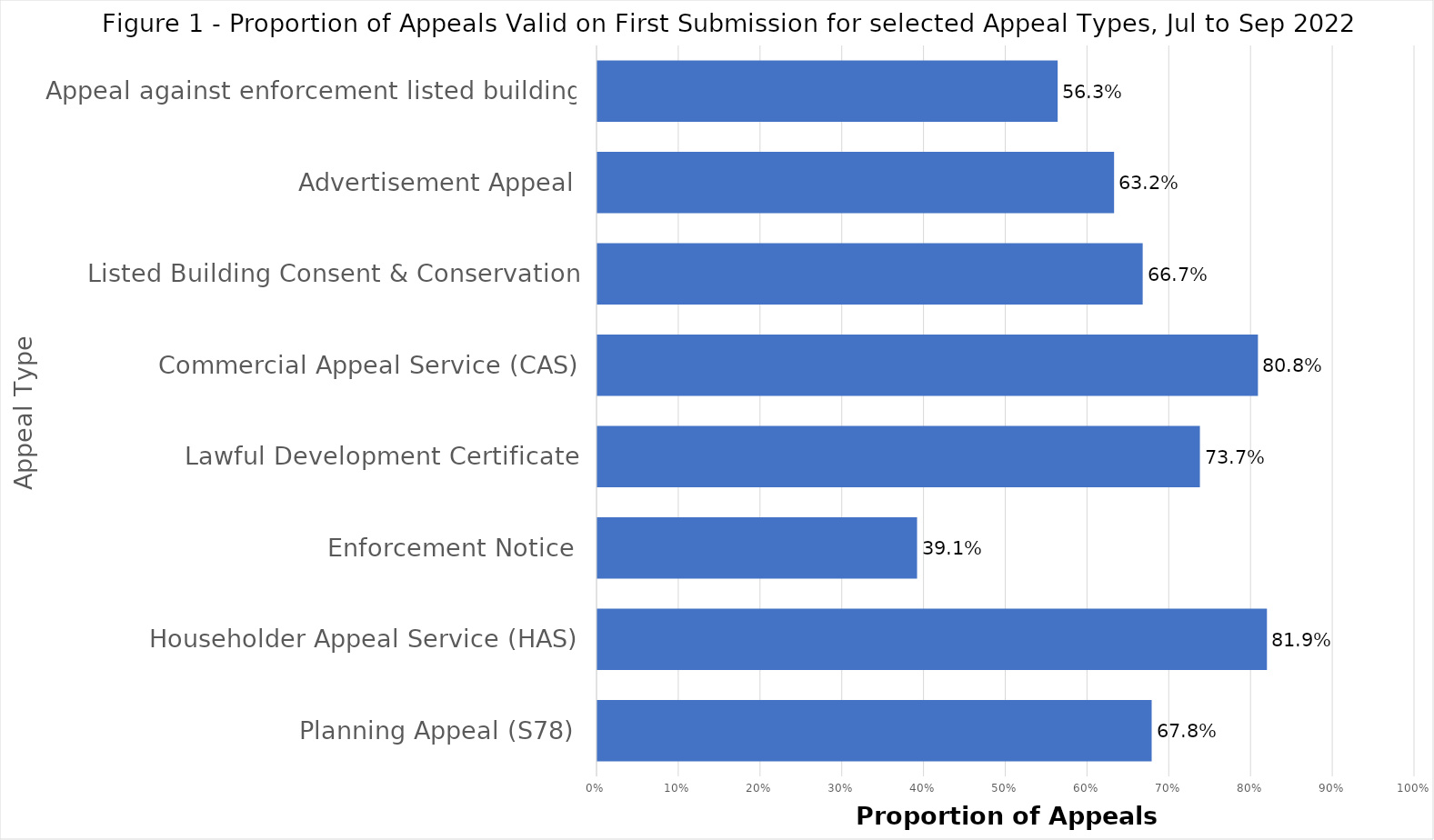
| Category | Proportion valid on first submission |
|---|---|
| Planning Appeal (S78) | 0.678 |
| Householder Appeal Service (HAS) | 0.819 |
| Enforcement Notice | 0.391 |
| Lawful Development Certificate | 0.737 |
| Commercial Appeal Service (CAS) | 0.808 |
| Listed Building Consent & Conservation | 0.667 |
| Advertisement Appeal | 0.632 |
| Appeal against enforcement listed building | 0.563 |